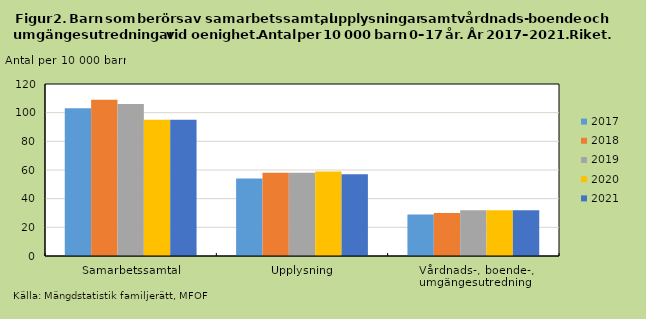
| Category | 2017 | 2018 | 2019 | 2020 | 2021 |
|---|---|---|---|---|---|
| Samarbetssamtal | 103 | 109 | 106 | 95 | 95 |
| Upplysning | 54 | 58 | 58 | 59 | 57 |
| Vårdnads-, boende-, umgängesutredning | 29 | 30 | 32 | 32 | 32 |